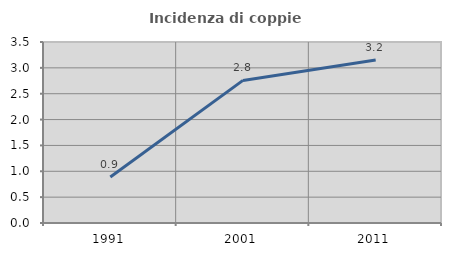
| Category | Incidenza di coppie miste |
|---|---|
| 1991.0 | 0.889 |
| 2001.0 | 2.757 |
| 2011.0 | 3.153 |